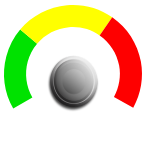
| Category | PIE |
|---|---|
| 0 | 7 |
| 1 | 0.34 |
| 2 | 18.16 |